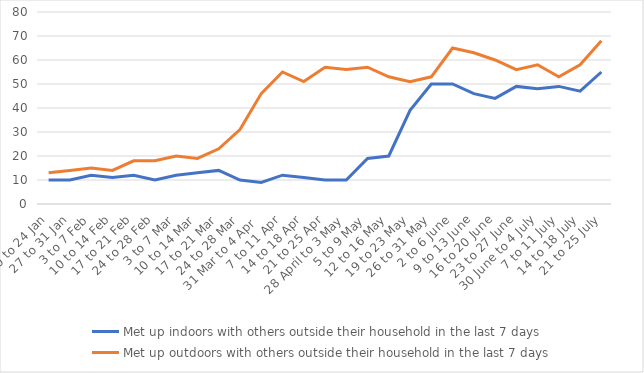
| Category | Met up indoors with others outside their household in the last 7 days | Met up outdoors with others outside their household in the last 7 days |
|---|---|---|
| 20 to 24 Jan | 10 | 13 |
| 27 to 31 Jan | 10 | 14 |
| 3 to 7 Feb | 12 | 15 |
| 10 to 14 Feb | 11 | 14 |
| 17 to 21 Feb | 12 | 18 |
| 24 to 28 Feb | 10 | 18 |
| 3 to 7 Mar | 12 | 20 |
| 10 to 14 Mar | 13 | 19 |
| 17 to 21 Mar | 14 | 23 |
| 24 to 28 Mar | 10 | 31 |
| 31 Mar to 4 Apr  | 9 | 46 |
| 7 to 11 Apr | 12 | 55 |
| 14 to 18 Apr | 11 | 51 |
| 21 to 25 Apr | 10 | 57 |
| 28 April to 3 May | 10 | 56 |
| 5 to 9 May | 19 | 57 |
| 12 to 16 May | 20 | 53 |
| 19 to 23 May | 39 | 51 |
| 26 to 31 May | 50 | 53 |
| 2 to 6 June | 50 | 65 |
| 9 to 13 June | 46 | 63 |
| 16 to 20 June | 44 | 60 |
| 23 to 27 June | 49 | 56 |
| 30 June to 4 July | 48 | 58 |
| 7 to 11 July | 49 | 53 |
| 14 to 18 July | 47 | 58 |
| 21 to 25 July | 55 | 68 |